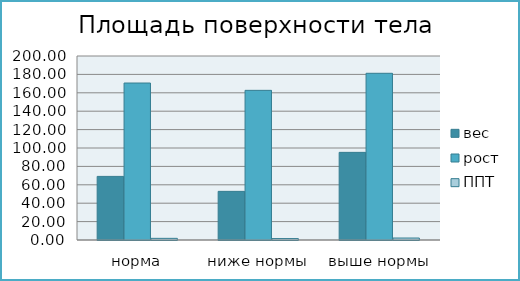
| Category | вес | рост | ППТ |
|---|---|---|---|
| норма | 69.138 | 170.625 | 1.8 |
| ниже нормы | 52.867 | 162.667 | 1.555 |
| выше нормы | 95.26 | 181.2 | 2.153 |